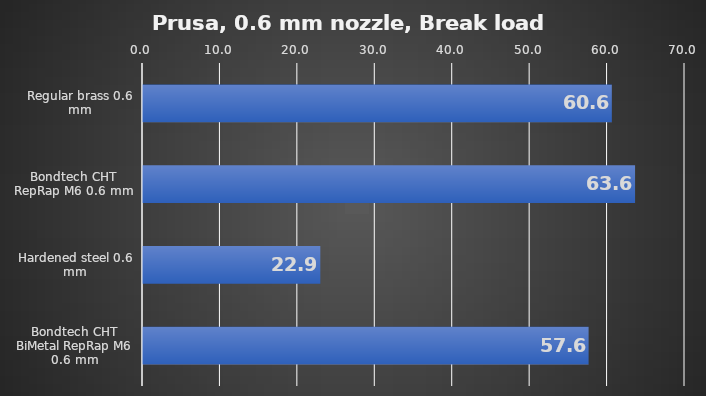
| Category | Average |
|---|---|
| Regular brass 0.6 mm | 60.55 |
| Bondtech CHT RepRap M6 0.6 mm | 63.55 |
| Hardened steel 0.6 mm | 22.9 |
| Bondtech CHT BiMetal RepRap M6 0.6 mm | 57.55 |